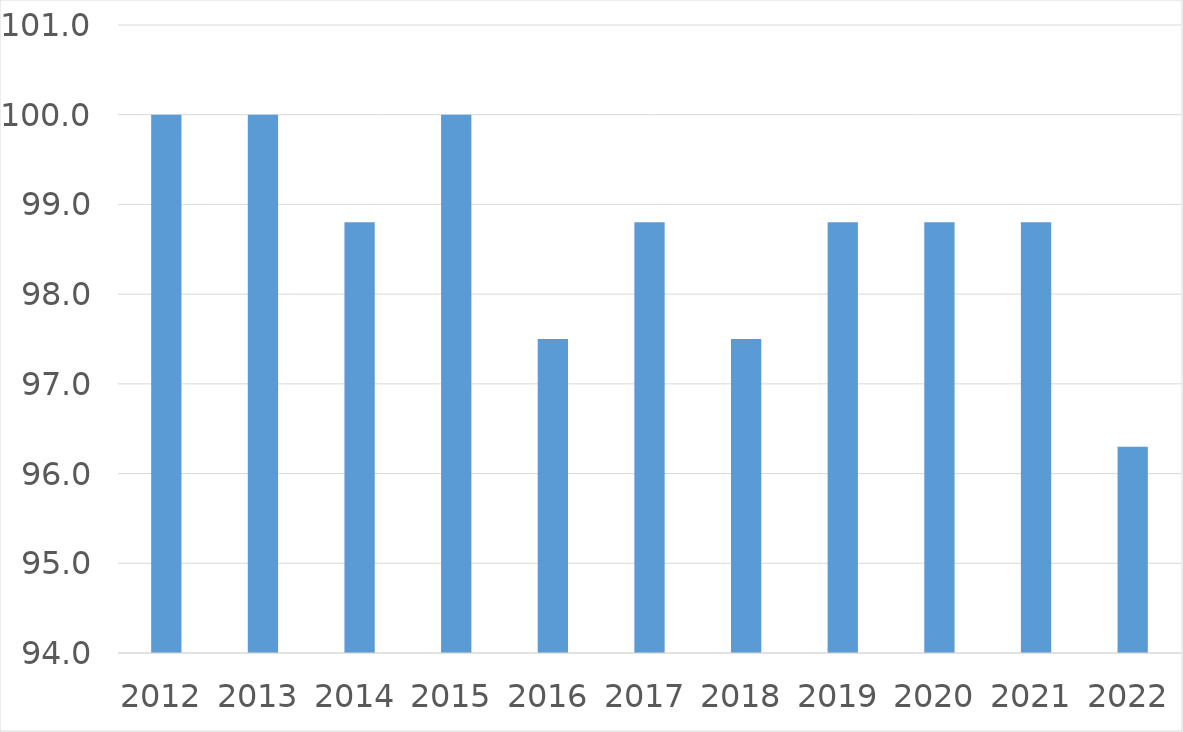
| Category | Series 0 |
|---|---|
| 2012 | 100 |
| 2013 | 100 |
| 2014 | 98.8 |
| 2015 | 100 |
| 2016 | 97.5 |
| 2017 | 98.8 |
| 2018 | 97.5 |
| 2019 | 98.8 |
| 2020 | 98.8 |
| 2021 | 98.8 |
| 2022 | 96.3 |